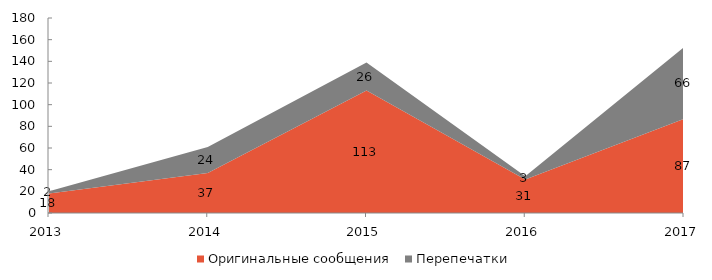
| Category | Оригинальные сообщения | Перепечатки |
|---|---|---|
| 2013 | 18 | 2 |
| 2014 | 37 | 24 |
| 2015 | 113 | 26 |
| 2016 | 31 | 3 |
| 2017 | 87 | 66 |